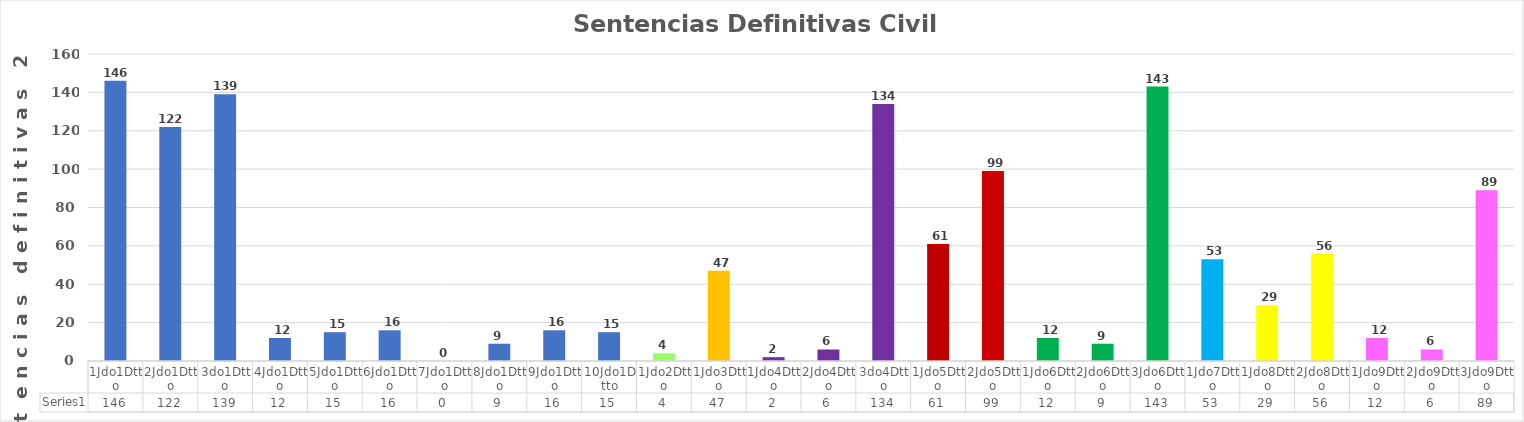
| Category | Series 0 |
|---|---|
| 1Jdo1Dtto | 146 |
| 2Jdo1Dtto | 122 |
| 3do1Dtto | 139 |
| 4Jdo1Dtto | 12 |
| 5Jdo1Dtto | 15 |
| 6Jdo1Dtto | 16 |
| 7Jdo1Dtto | 0 |
| 8Jdo1Dtto | 9 |
| 9Jdo1Dtto | 16 |
| 10Jdo1Dtto | 15 |
| 1Jdo2Dtto | 4 |
| 1Jdo3Dtto | 47 |
| 1Jdo4Dtto | 2 |
| 2Jdo4Dtto | 6 |
| 3do4Dtto | 134 |
| 1Jdo5Dtto | 61 |
| 2Jdo5Dtto | 99 |
| 1Jdo6Dtto | 12 |
| 2Jdo6Dtto | 9 |
| 3Jdo6Dtto | 143 |
| 1Jdo7Dtto | 53 |
| 1Jdo8Dtto | 29 |
| 2Jdo8Dtto | 56 |
| 1Jdo9Dtto | 12 |
| 2Jdo9Dtto | 6 |
| 3Jdo9Dtto | 89 |